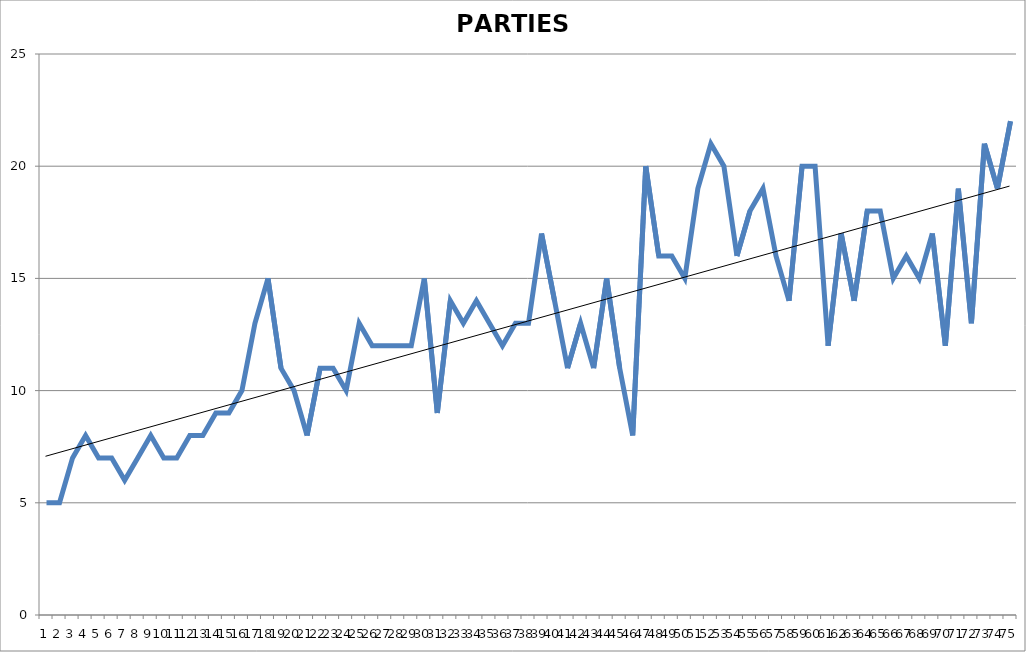
| Category | PARTIES 1948-2022 |
|---|---|
| 0 | 5 |
| 1 | 5 |
| 2 | 7 |
| 3 | 8 |
| 4 | 7 |
| 5 | 7 |
| 6 | 6 |
| 7 | 7 |
| 8 | 8 |
| 9 | 7 |
| 10 | 7 |
| 11 | 8 |
| 12 | 8 |
| 13 | 9 |
| 14 | 9 |
| 15 | 10 |
| 16 | 13 |
| 17 | 15 |
| 18 | 11 |
| 19 | 10 |
| 20 | 8 |
| 21 | 11 |
| 22 | 11 |
| 23 | 10 |
| 24 | 13 |
| 25 | 12 |
| 26 | 12 |
| 27 | 12 |
| 28 | 12 |
| 29 | 15 |
| 30 | 9 |
| 31 | 14 |
| 32 | 13 |
| 33 | 14 |
| 34 | 13 |
| 35 | 12 |
| 36 | 13 |
| 37 | 13 |
| 38 | 17 |
| 39 | 14 |
| 40 | 11 |
| 41 | 13 |
| 42 | 11 |
| 43 | 15 |
| 44 | 11 |
| 45 | 8 |
| 46 | 20 |
| 47 | 16 |
| 48 | 16 |
| 49 | 15 |
| 50 | 19 |
| 51 | 21 |
| 52 | 20 |
| 53 | 16 |
| 54 | 18 |
| 55 | 19 |
| 56 | 16 |
| 57 | 14 |
| 58 | 20 |
| 59 | 20 |
| 60 | 12 |
| 61 | 17 |
| 62 | 14 |
| 63 | 18 |
| 64 | 18 |
| 65 | 15 |
| 66 | 16 |
| 67 | 15 |
| 68 | 17 |
| 69 | 12 |
| 70 | 19 |
| 71 | 13 |
| 72 | 21 |
| 73 | 19 |
| 74 | 22 |